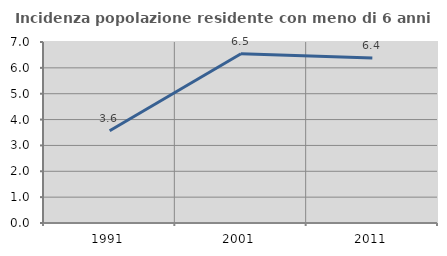
| Category | Incidenza popolazione residente con meno di 6 anni |
|---|---|
| 1991.0 | 3.565 |
| 2001.0 | 6.548 |
| 2011.0 | 6.377 |